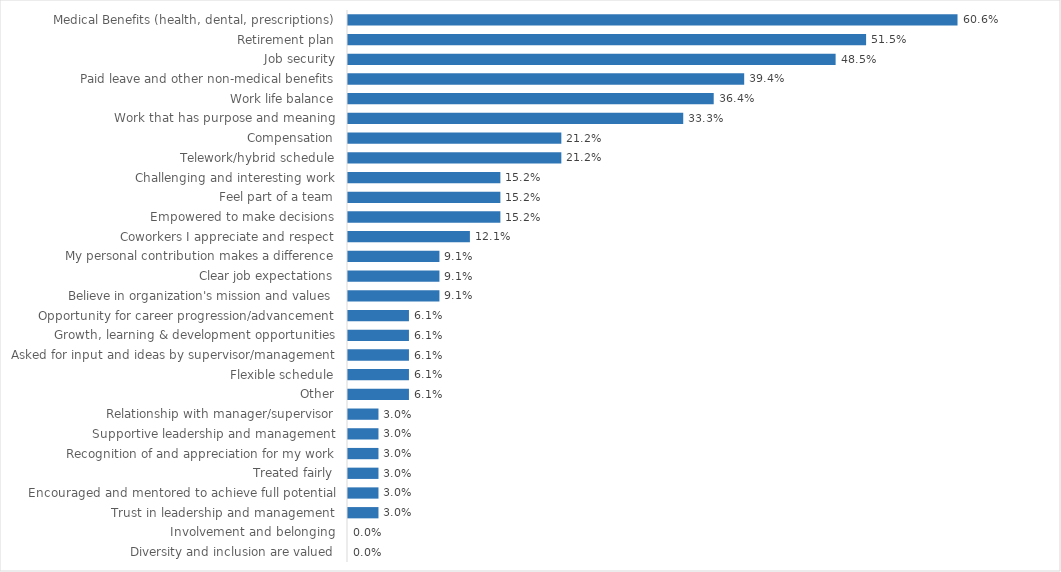
| Category | Military |
|---|---|
| Medical Benefits (health, dental, prescriptions) | 0.606 |
| Retirement plan | 0.515 |
| Job security | 0.485 |
| Paid leave and other non-medical benefits | 0.394 |
| Work life balance | 0.364 |
| Work that has purpose and meaning | 0.333 |
| Compensation | 0.212 |
| Telework/hybrid schedule | 0.212 |
| Challenging and interesting work | 0.152 |
| Feel part of a team | 0.152 |
| Empowered to make decisions | 0.152 |
| Coworkers I appreciate and respect | 0.121 |
| My personal contribution makes a difference | 0.091 |
| Clear job expectations | 0.091 |
| Believe in organization's mission and values | 0.091 |
| Opportunity for career progression/advancement | 0.061 |
| Growth, learning & development opportunities | 0.061 |
| Asked for input and ideas by supervisor/management | 0.061 |
| Flexible schedule | 0.061 |
| Other | 0.061 |
| Relationship with manager/supervisor | 0.03 |
| Supportive leadership and management | 0.03 |
| Recognition of and appreciation for my work | 0.03 |
| Treated fairly | 0.03 |
| Encouraged and mentored to achieve full potential | 0.03 |
| Trust in leadership and management | 0.03 |
| Involvement and belonging | 0 |
| Diversity and inclusion are valued | 0 |